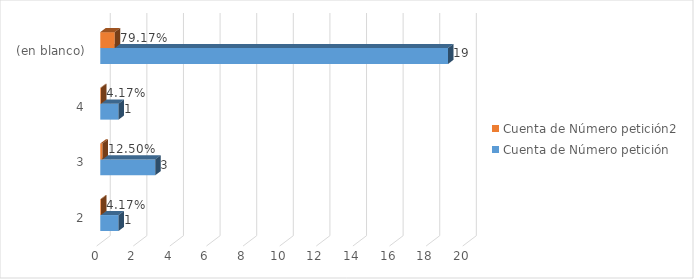
| Category | Cuenta de Número petición | Cuenta de Número petición2 |
|---|---|---|
| 2 | 1 | 0.042 |
| 3 | 3 | 0.125 |
| 4 | 1 | 0.042 |
| (en blanco) | 19 | 0.792 |